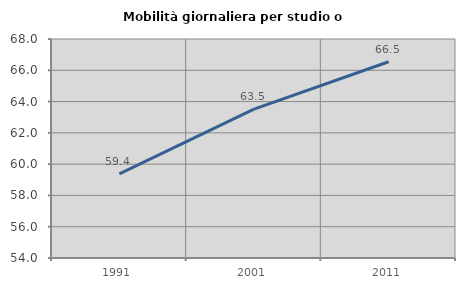
| Category | Mobilità giornaliera per studio o lavoro |
|---|---|
| 1991.0 | 59.374 |
| 2001.0 | 63.519 |
| 2011.0 | 66.545 |